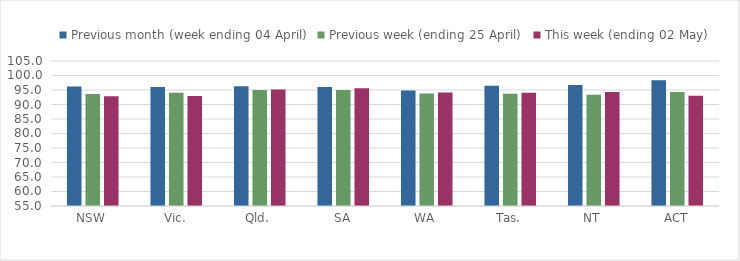
| Category | Previous month (week ending 04 April) | Previous week (ending 25 April) | This week (ending 02 May) |
|---|---|---|---|
| NSW | 96.192 | 93.594 | 92.864 |
| Vic. | 96.016 | 94.056 | 92.965 |
| Qld. | 96.277 | 94.987 | 95.163 |
| SA | 96.034 | 95.027 | 95.562 |
| WA | 94.828 | 93.799 | 94.113 |
| Tas. | 96.453 | 93.747 | 94.083 |
| NT | 96.744 | 93.399 | 94.342 |
| ACT | 98.38 | 94.284 | 93.012 |